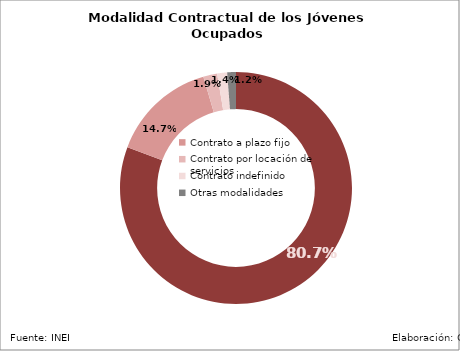
| Category | Series 0 | Series 1 |
|---|---|---|
| Sin contrato |  | 0.807 |
| Contrato a plazo fijo |  | 0.147 |
| Contrato por locación de servicios  |  | 0.019 |
| Contrato indefinido |  | 0.014 |
| Otras modalidades |  | 0.012 |